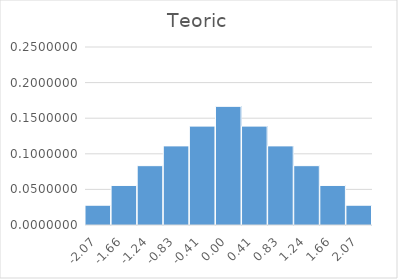
| Category | Teoric |
|---|---|
| -2.070196678027062 | 0.028 |
| -1.6561573424216496 | 0.056 |
| -1.2421180068162372 | 0.083 |
| -0.8280786712108247 | 0.111 |
| -0.4140393356054121 | 0.139 |
| 3.6774080279170507e-16 | 0.167 |
| 0.4140393356054129 | 0.139 |
| 0.8280786712108253 | 0.111 |
| 1.2421180068162379 | 0.083 |
| 1.6561573424216505 | 0.056 |
| 2.070196678027063 | 0.028 |